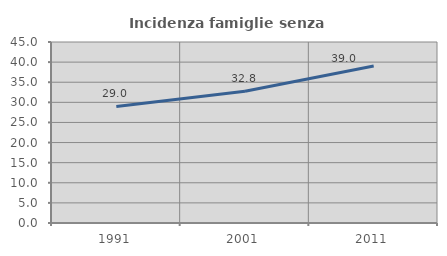
| Category | Incidenza famiglie senza nuclei |
|---|---|
| 1991.0 | 28.989 |
| 2001.0 | 32.76 |
| 2011.0 | 39.045 |